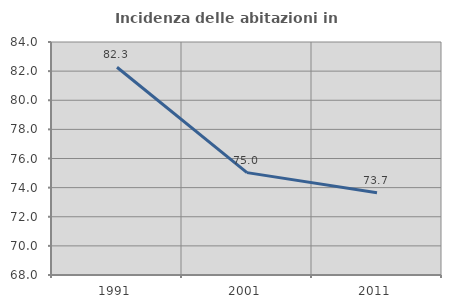
| Category | Incidenza delle abitazioni in proprietà  |
|---|---|
| 1991.0 | 82.269 |
| 2001.0 | 75.029 |
| 2011.0 | 73.65 |